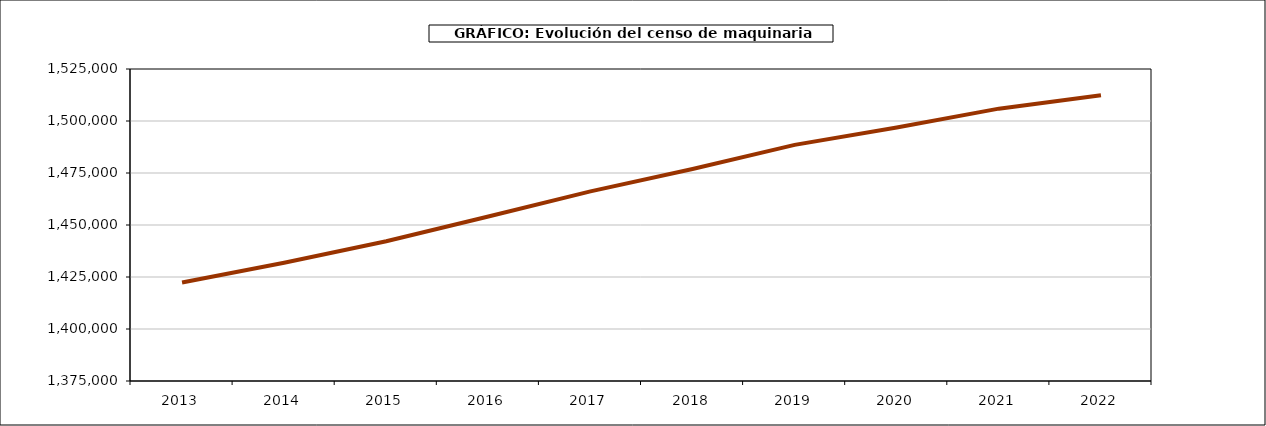
| Category | maquinaria |
|---|---|
| 2013.0 | 1422371 |
| 2014.0 | 1431819 |
| 2015.0 | 1442169 |
| 2016.0 | 1454062 |
| 2017.0 | 1466159 |
| 2018.0 | 1476889 |
| 2019.0 | 1488523 |
| 2020.0 | 1496904 |
| 2021.0 | 1505938 |
| 2022.0 | 1512342 |